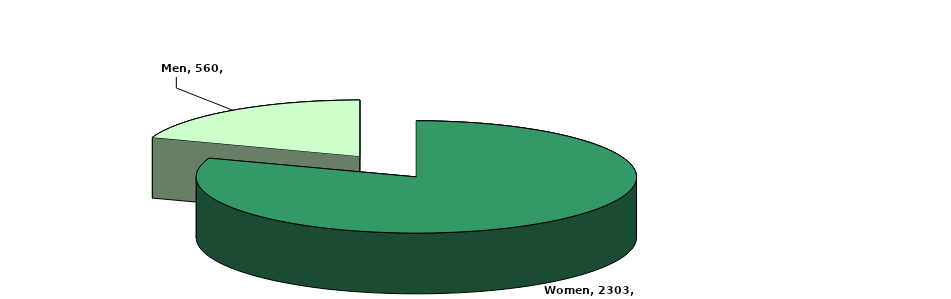
| Category | Number |
|---|---|
| Women | 2303 |
| Men | 560 |